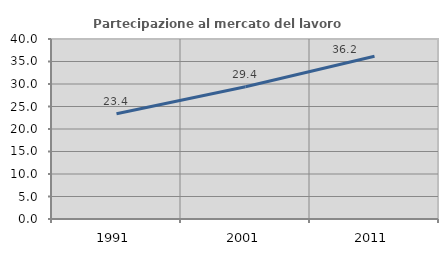
| Category | Partecipazione al mercato del lavoro  femminile |
|---|---|
| 1991.0 | 23.404 |
| 2001.0 | 29.386 |
| 2011.0 | 36.184 |